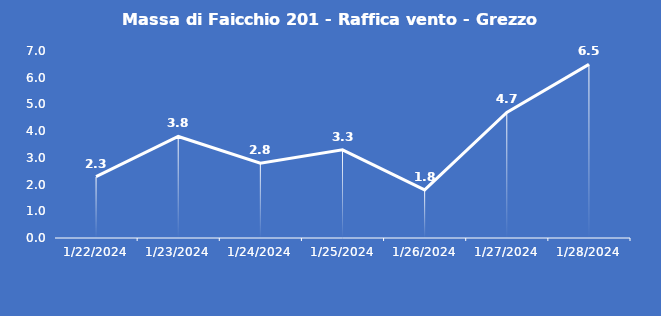
| Category | Massa di Faicchio 201 - Raffica vento - Grezzo (m/s) |
|---|---|
| 1/22/24 | 2.3 |
| 1/23/24 | 3.8 |
| 1/24/24 | 2.8 |
| 1/25/24 | 3.3 |
| 1/26/24 | 1.8 |
| 1/27/24 | 4.7 |
| 1/28/24 | 6.5 |